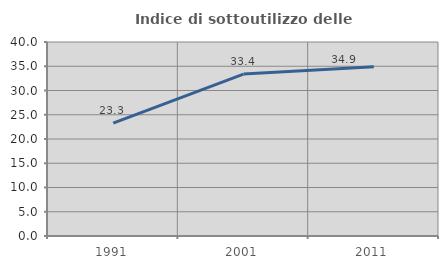
| Category | Indice di sottoutilizzo delle abitazioni  |
|---|---|
| 1991.0 | 23.256 |
| 2001.0 | 33.378 |
| 2011.0 | 34.898 |